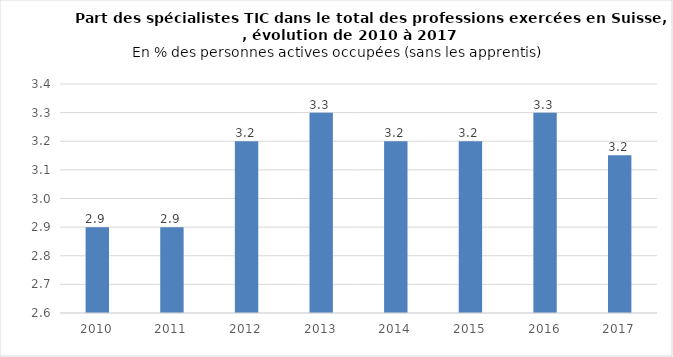
| Category | %  |
|---|---|
| 2010.0 | 2.9 |
| 2011.0 | 2.9 |
| 2012.0 | 3.2 |
| 2013.0 | 3.3 |
| 2014.0 | 3.2 |
| 2015.0 | 3.2 |
| 2016.0 | 3.3 |
| 2017.0 | 3.151 |